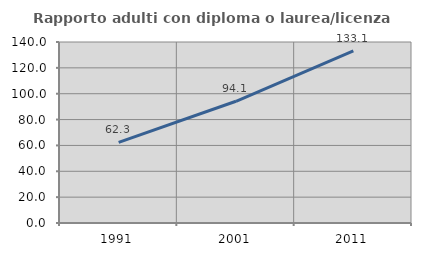
| Category | Rapporto adulti con diploma o laurea/licenza media  |
|---|---|
| 1991.0 | 62.336 |
| 2001.0 | 94.148 |
| 2011.0 | 133.083 |